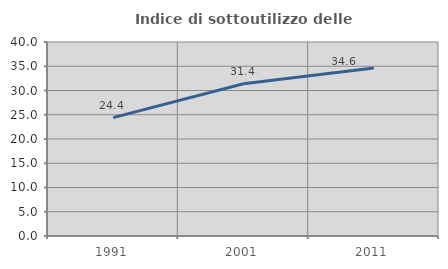
| Category | Indice di sottoutilizzo delle abitazioni  |
|---|---|
| 1991.0 | 24.402 |
| 2001.0 | 31.395 |
| 2011.0 | 34.632 |